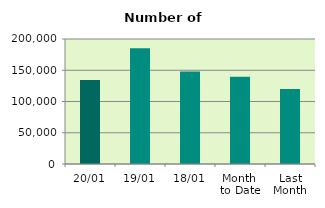
| Category | Series 0 |
|---|---|
| 20/01 | 134436 |
| 19/01 | 185352 |
| 18/01 | 148112 |
| Month 
to Date | 139607.857 |
| Last
Month | 120108.783 |